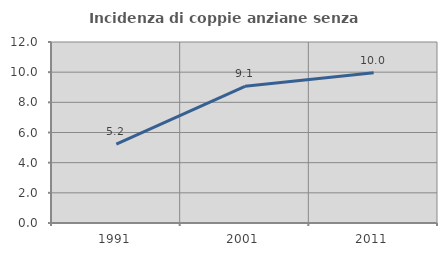
| Category | Incidenza di coppie anziane senza figli  |
|---|---|
| 1991.0 | 5.226 |
| 2001.0 | 9.061 |
| 2011.0 | 9.958 |